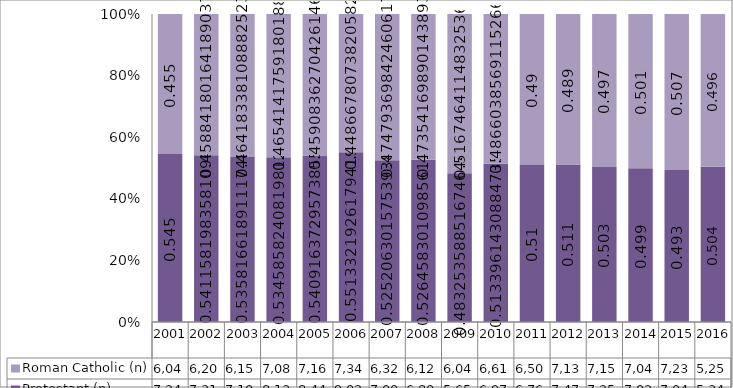
| Category | Protestant (n) | Roman Catholic (n) |
|---|---|---|
| 2001.0 | 7242 | 6042 |
| 2002.0 | 7317 | 6204 |
| 2003.0 | 7106 | 6156 |
| 2004.0 | 8138 | 7085 |
| 2005.0 | 8441 | 7164 |
| 2006.0 | 9022 | 7342 |
| 2007.0 | 7001 | 6329 |
| 2008.0 | 6805 | 6121 |
| 2009.0 | 5656 | 6048 |
| 2010.0 | 6975 | 6611 |
| 2011.0 | 6765 | 6504 |
| 2012.0 | 7473 | 7139 |
| 2013.0 | 7252 | 7154 |
| 2014.0 | 7022 | 7049 |
| 2015.0 | 7047 | 7233 |
| 2016.0 | 5345 | 5255 |